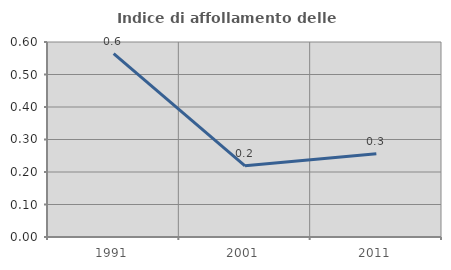
| Category | Indice di affollamento delle abitazioni  |
|---|---|
| 1991.0 | 0.564 |
| 2001.0 | 0.219 |
| 2011.0 | 0.256 |